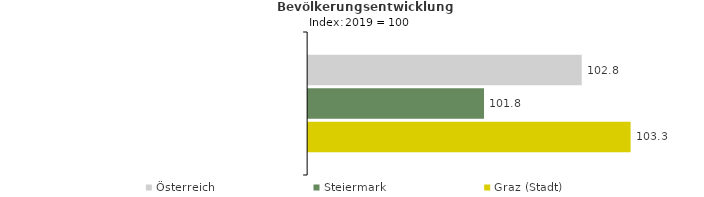
| Category | Österreich | Steiermark | Graz (Stadt) |
|---|---|---|---|
| 2023.0 | 102.8 | 101.8 | 103.3 |